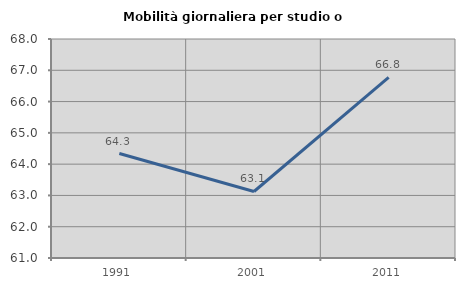
| Category | Mobilità giornaliera per studio o lavoro |
|---|---|
| 1991.0 | 64.339 |
| 2001.0 | 63.126 |
| 2011.0 | 66.776 |